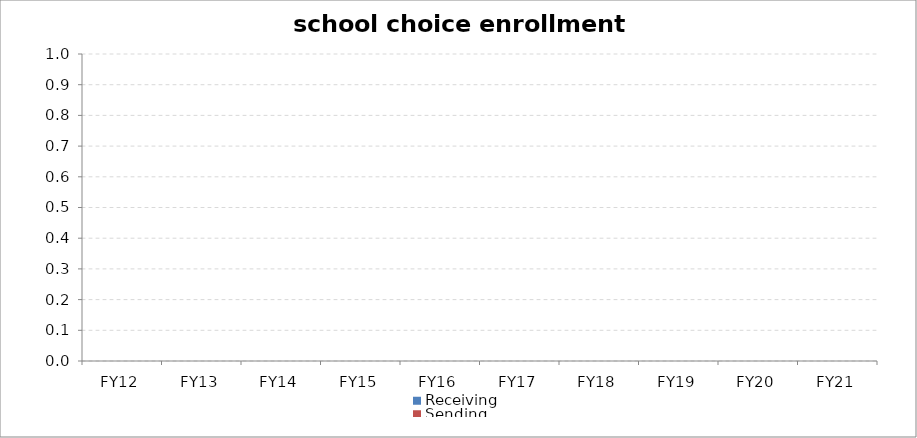
| Category | Receiving | Sending |
|---|---|---|
| FY12 | 0 | 0 |
| FY13 | 0 | 0 |
| FY14 | 0 | 0 |
| FY15 | 0 | 0 |
| FY16 | 0 | 0 |
| FY17 | 0 | 0 |
| FY18 | 0 | 0 |
| FY19 | 0 | 0 |
| FY20 | 0 | 0 |
| FY21 | 0 | 0 |